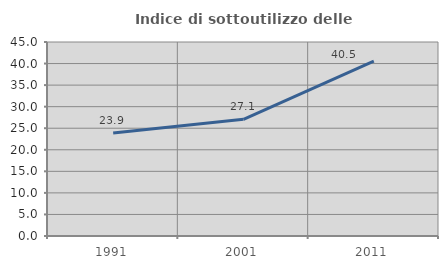
| Category | Indice di sottoutilizzo delle abitazioni  |
|---|---|
| 1991.0 | 23.879 |
| 2001.0 | 27.069 |
| 2011.0 | 40.549 |